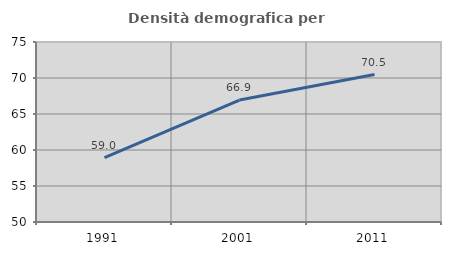
| Category | Densità demografica |
|---|---|
| 1991.0 | 58.95 |
| 2001.0 | 66.94 |
| 2011.0 | 70.478 |